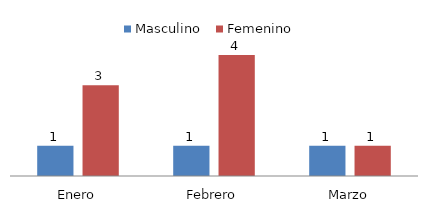
| Category | Masculino | Femenino |
|---|---|---|
| Enero | 1 | 3 |
| Febrero | 1 | 4 |
| Marzo | 1 | 1 |